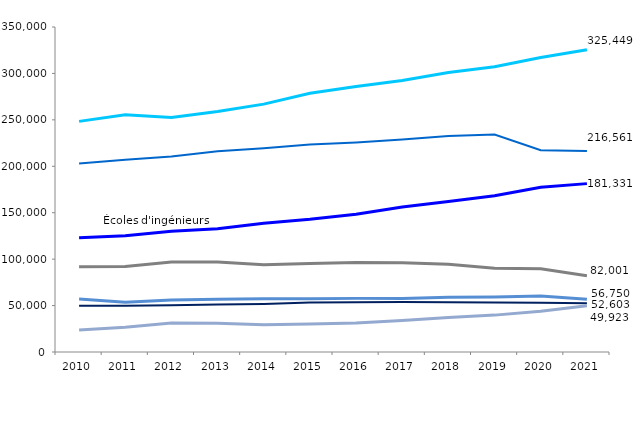
| Category | Université (formations scientifiques + ingénieurs) | Université (santé) | Écoles d'ingénieurs | STS et assimilés scientifique (scolaires) | DUT scientifique | CPGE scientifique | STS et assimilés scientifique (apprentis) |
|---|---|---|---|---|---|---|---|
| 2010.0 | 248381 | 202912 | 123018 | 91793 | 56982 | 49678 | 23697 |
| 2011.0 | 255594 | 206947 | 125268 | 92039 | 53572 | 49747 | 26626 |
| 2012.0 | 252633 | 210424 | 129924 | 96878 | 56033 | 50479 | 31172 |
| 2013.0 | 258993 | 216224 | 132745 | 96824 | 56710 | 51202 | 30978 |
| 2014.0 | 266962 | 219328 | 138757 | 94060 | 57302 | 51774 | 29319 |
| 2015.0 | 278635 | 223528 | 142903 | 95427 | 57310 | 53204 | 30062 |
| 2016.0 | 285817 | 225662 | 148460 | 96410 | 57750 | 53681 | 31241 |
| 2017.0 | 292434 | 228800 | 156123 | 96171 | 57678 | 53848 | 33903 |
| 2018.0 | 301050 | 232512 | 162187 | 94598 | 59005 | 53569 | 37160 |
| 2019.0 | 307170 | 234109 | 168226 | 90209 | 59220 | 53218 | 39715 |
| 2020.0 | 317085 | 217284 | 177492 | 89748 | 60271 | 53136 | 43862 |
| 2021.0 | 325449 | 216561 | 181331 | 82001 | 56750 | 52603 | 49923 |